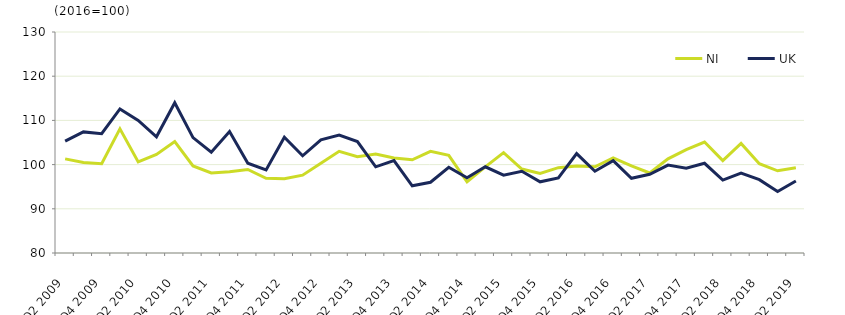
| Category | NI  | UK  |
|---|---|---|
| Q2 2009 | 101.3 | 105.3 |
|  | 100.5 | 107.4 |
| Q4 2009 | 100.2 | 107 |
|  | 108.1 | 112.6 |
| Q2 2010 | 100.6 | 110 |
|  | 102.3 | 106.3 |
| Q4 2010 | 105.2 | 114 |
|  | 99.7 | 106.1 |
| Q2 2011 | 98.1 | 102.8 |
|  | 98.4 | 107.5 |
| Q4 2011 | 98.9 | 100.3 |
|  | 96.9 | 98.8 |
| Q2 2012 | 96.8 | 106.2 |
|  | 97.6 | 102 |
| Q4 2012 | 100.3 | 105.6 |
|  | 103 | 106.7 |
| Q2 2013 | 101.8 | 105.2 |
|  | 102.4 | 99.5 |
| Q4 2013 | 101.5 | 100.9 |
|  | 101.1 | 95.2 |
| Q2 2014 | 103 | 96 |
|  | 102.1 | 99.4 |
| Q4 2014 | 96.1 | 97 |
|  | 99.5 | 99.5 |
| Q2 2015 | 102.7 | 97.6 |
|  | 99 | 98.5 |
| Q4 2015 | 98 | 96.1 |
|  | 99.3 | 97 |
| Q2 2016 | 99.7 | 102.5 |
|  | 99.5 | 98.5 |
| Q4 2016 | 101.5 | 100.9 |
|  | 99.7 | 96.9 |
| Q2 2017 | 98.1 | 97.8 |
|  | 101.3 | 99.9 |
| Q4 2017 | 103.4 | 99.2 |
|  | 105.1 | 100.3 |
| Q2 2018 | 100.9 | 96.5 |
|  | 104.8 | 98.1 |
| Q4 2018 | 100.2 | 96.6 |
|  | 98.6 | 93.9 |
| Q2 2019 | 99.3 | 96.3 |